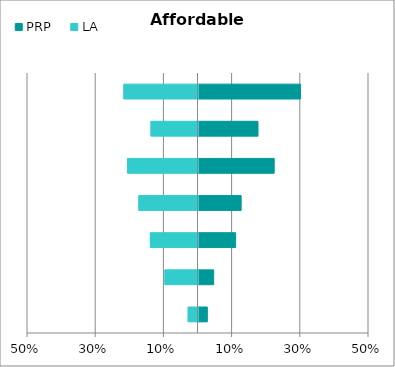
| Category | PRP | LA |
|---|---|---|
| Other | 0.026 | -0.029 |
| Retired | 0.045 | -0.097 |
| Unemployed (Jobseeker) | 0.109 | -0.14 |
| Unable to work due to sickness | 0.125 | -0.173 |
| Not seeking work | 0.222 | -0.206 |
| Part time worker | 0.175 | -0.138 |
| Full time worker | 0.299 | -0.217 |